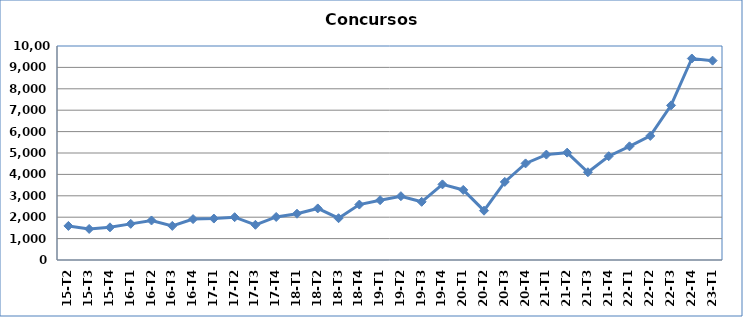
| Category | Series 0 |
|---|---|
| 15-T2 | 1593 |
| 15-T3 | 1451 |
| 15-T4 | 1526 |
| 16-T1 | 1689 |
| 16-T2 | 1847 |
| 16-T3 | 1593 |
| 16-T4 | 1911 |
| 17-T1 | 1937 |
| 17-T2 | 2001 |
| 17-T3 | 1645 |
| 17-T4 | 2011 |
| 18-T1 | 2162 |
| 18-T2 | 2410 |
| 18-T3 | 1953 |
| 18-T4 | 2590 |
| 19-T1 | 2796 |
| 19-T2 | 2982 |
| 19-T3 | 2719 |
| 19-T4 | 3534 |
| 20-T1 | 3274 |
| 20-T2 | 2305 |
| 20-T3 | 3649 |
| 20-T4 | 4513 |
| 21-T1 | 4925 |
| 21-T2 | 5017 |
| 21-T3 | 4101 |
| 21-T4 | 4849 |
| 22-T1 | 5312 |
| 22-T2 | 5798 |
| 22-T3 | 7225 |
| 22-T4 | 9416 |
| 23-T1 | 9316 |